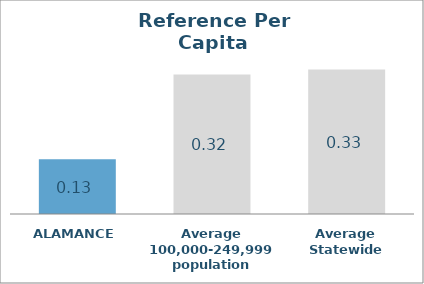
| Category | Series 0 |
|---|---|
| ALAMANCE | 0.126 |
| Average 100,000-249,999 population | 0.321 |
| Average Statewide | 0.332 |